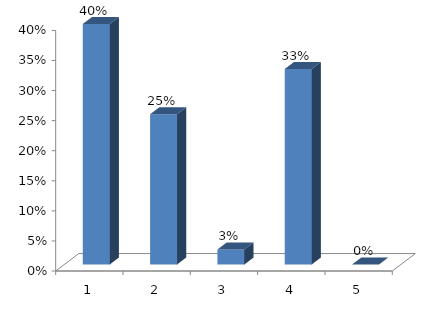
| Category | Series 0 |
|---|---|
| 0 | 0.4 |
| 1 | 0.25 |
| 2 | 0.025 |
| 3 | 0.325 |
| 4 | 0 |